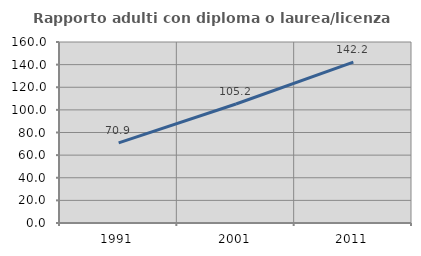
| Category | Rapporto adulti con diploma o laurea/licenza media  |
|---|---|
| 1991.0 | 70.851 |
| 2001.0 | 105.183 |
| 2011.0 | 142.177 |